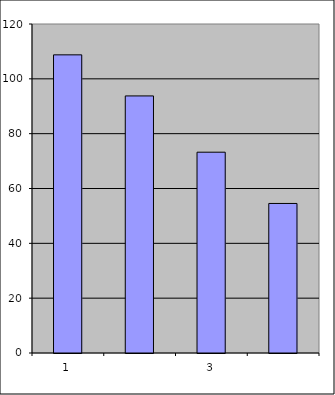
| Category | Series 0 |
|---|---|
| 0 | 108.75 |
| 1 | 93.762 |
| 2 | 73.241 |
| 3 | 54.541 |